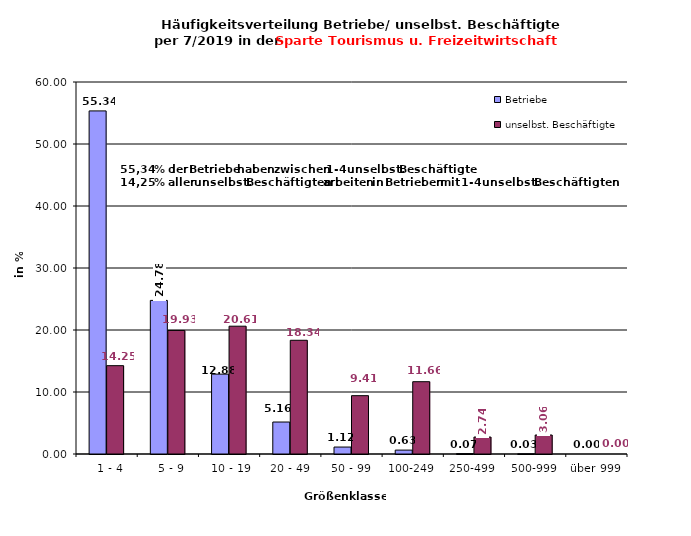
| Category | Betriebe | unselbst. Beschäftigte |
|---|---|---|
|   1 - 4 | 55.337 | 14.247 |
|   5 - 9 | 24.775 | 19.927 |
|  10 - 19 | 12.88 | 20.615 |
| 20 - 49 | 5.159 | 18.342 |
| 50 - 99 | 1.12 | 9.408 |
| 100-249 | 0.628 | 11.662 |
| 250-499 | 0.068 | 2.735 |
| 500-999 | 0.034 | 3.063 |
| über 999 | 0 | 0 |